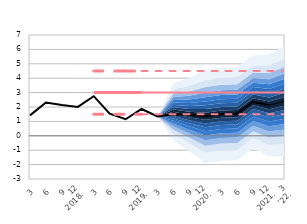
| Category | Series 5 | Series 20 | Series 25 | Series 24 | Series 23 |
|---|---|---|---|---|---|
| 3 | 1.417 |  | 3 | 1.5 | 4.5 |
| 6 | 2.314 |  | 3 | 1.5 | 4.5 |
| 9 | 2.136 |  | 3 | 1.5 | 4.5 |
| 12
2018. | 2.004 |  | 3 | 1.5 | 4.5 |
| 3 | 2.751 |  | 3 | 1.5 | 4.5 |
| 6 | 1.531 |  | 3 | 1.5 | 4.5 |
| 9 | 1.15 |  | 3 | 1.5 | 4.5 |
| 12
2019. | 1.861 |  | 3 | 1.5 | 4.5 |
| 3 | 1.344 |  | 3 | 1.5 | 4.5 |
| 6 | 1.5 |  | 3 | 1.5 | 4.5 |
| 9 | 1.47 |  | 3 | 1.5 | 4.5 |
| 12
2020. | 1.356 |  | 3 | 1.5 | 4.5 |
| 3 | 1.501 |  | 3 | 1.5 | 4.5 |
| 6 | 1.54 |  | 3 | 1.5 | 4.5 |
| 9 | 2.361 |  | 3 | 1.5 | 4.5 |
| 12
2021. | 2.119 |  | 3 | 1.5 | 4.5 |
| 3
'22. | 2.4 |  | 3 | 1.5 | 4.5 |